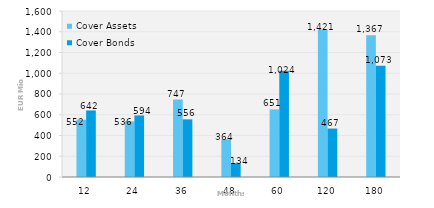
| Category | Cover Assets | Cover Bonds |
|---|---|---|
| 12.0 | 552.397 | 641.8 |
| 24.0 | 536.196 | 593.549 |
| 36.0 | 746.937 | 555.765 |
| 48.0 | 364.025 | 133.883 |
| 60.0 | 651.342 | 1024 |
| 120.0 | 1420.916 | 466.942 |
| 180.0 | 1366.85 | 1073.484 |